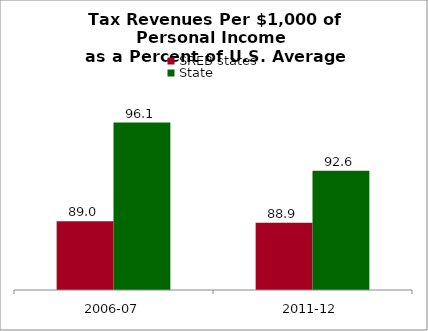
| Category | SREB states | State |
|---|---|---|
| 2006-07 | 88.967 | 96.085 |
| 2011-12 | 88.857 | 92.608 |